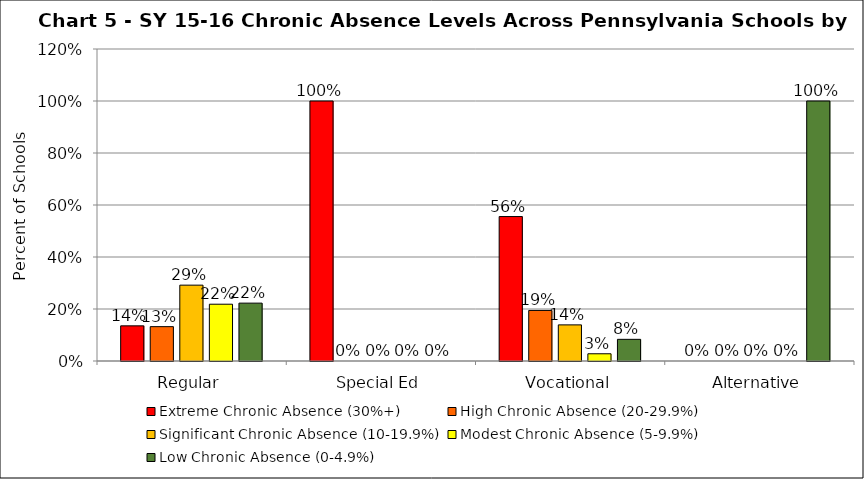
| Category | Extreme Chronic Absence (30%+) | High Chronic Absence (20-29.9%) | Significant Chronic Absence (10-19.9%) | Modest Chronic Absence (5-9.9%) | Low Chronic Absence (0-4.9%) |
|---|---|---|---|---|---|
| 0 | 0.135 | 0.132 | 0.292 | 0.218 | 0.223 |
| 1 | 1 | 0 | 0 | 0 | 0 |
| 2 | 0.556 | 0.194 | 0.139 | 0.028 | 0.083 |
| 3 | 0 | 0 | 0 | 0 | 1 |